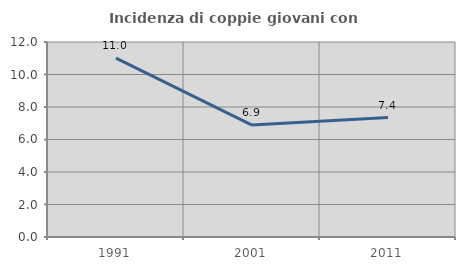
| Category | Incidenza di coppie giovani con figli |
|---|---|
| 1991.0 | 11.012 |
| 2001.0 | 6.886 |
| 2011.0 | 7.353 |